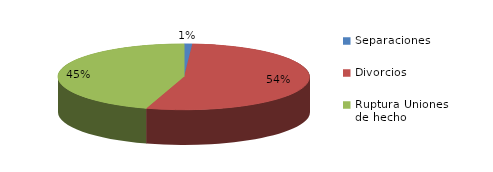
| Category | Series 0 |
|---|---|
| Separaciones | 16 |
| Divorcios | 821 |
| Ruptura Uniones de hecho | 690 |